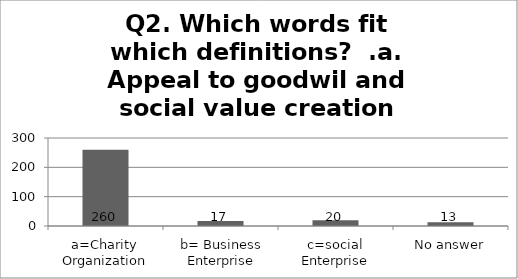
| Category | Q2. Which words fit which definitions?  .a. Appeal to goodwil and social value creation |
|---|---|
| a=Charity Organization | 260 |
| b= Business Enterprise | 17 |
| c=social Enterprise | 20 |
| No answer | 13 |